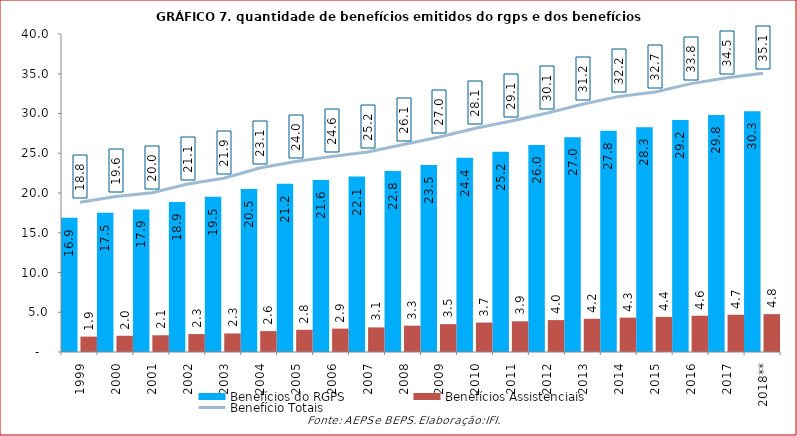
| Category | Benefícios do RGPS | Benefícios Assistenciais |
|---|---|---|
| 1999 | 16897117 | 1937470 |
| 2000 | 17531161 | 2041587 |
| 2001 | 17927697 | 2105161 |
| 2002 | 18872666 | 2252846 |
| 2003 | 19521266 | 2330419 |
| 2004 | 20517258 | 2629711 |
| 2005 | 21158137 | 2793183 |
| 2006 | 21644885 | 2940141 |
| 2007 | 22066263 | 3096566 |
| 2008 | 22776205 | 3311827 |
| 2009 | 23534497 | 3504080 |
| 2010 | 24426882 | 3703505 |
| 2011 | 25176323 | 3863503 |
| 2012 | 26032855 | 4012482 |
| 2013 | 27009011 | 4178364 |
| 2014 | 27818973 | 4322232 |
| 2015 | 28276347 | 4414335 |
| 2016 | 29183383 | 4562162 |
| 2017 | 29804964 | 4683007 |
| 2018** | 30278655 | 4760966 |